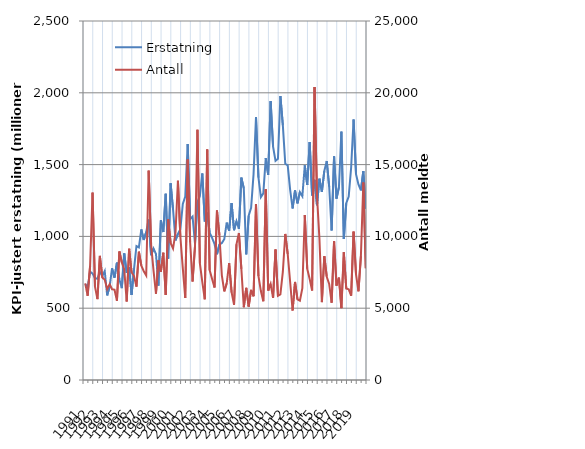
| Category | Erstatning |
|---|---|
| 1991.0 | 668.281 |
| nan | 646.488 |
| nan | 754.324 |
| nan | 741.503 |
| 1992.0 | 709.488 |
| nan | 704.957 |
| nan | 752.702 |
| nan | 722.519 |
| 1993.0 | 758.675 |
| nan | 589.203 |
| nan | 650.073 |
| nan | 777.991 |
| 1994.0 | 712.353 |
| nan | 817.185 |
| nan | 700.389 |
| nan | 639.47 |
| 1995.0 | 881.358 |
| nan | 744.95 |
| nan | 786.032 |
| nan | 592.778 |
| 1996.0 | 772.323 |
| nan | 933.033 |
| nan | 923.728 |
| nan | 1048.134 |
| 1997.0 | 974.883 |
| nan | 1030.942 |
| nan | 1117.681 |
| nan | 868.927 |
| 1998.0 | 915.401 |
| nan | 877.212 |
| nan | 657.44 |
| nan | 1111.934 |
| 1999.0 | 1030.252 |
| nan | 1297.352 |
| nan | 845.204 |
| nan | 1370.259 |
| 2000.0 | 1188.306 |
| nan | 972.49 |
| nan | 1016.713 |
| nan | 1049.276 |
| 2001.0 | 1226.506 |
| nan | 1276.704 |
| nan | 1643.899 |
| nan | 1120.334 |
| 2002.0 | 1137.902 |
| nan | 949.705 |
| nan | 1239.219 |
| nan | 1281.771 |
| 2003.0 | 1438.216 |
| nan | 1103.994 |
| nan | 1165.383 |
| nan | 1026.329 |
| 2004.0 | 989.843 |
| nan | 946.898 |
| nan | 875.658 |
| nan | 943.378 |
| 2005.0 | 953.6 |
| nan | 981.057 |
| nan | 1095.972 |
| nan | 1040.028 |
| 2006.0 | 1231.522 |
| nan | 1043.07 |
| nan | 1106.176 |
| nan | 1052.282 |
| 2007.0 | 1409.17 |
| nan | 1334.926 |
| nan | 874.596 |
| nan | 1144.153 |
| 2008.0 | 1198.374 |
| nan | 1433.738 |
| nan | 1830.653 |
| nan | 1410.233 |
| 2009.0 | 1273.319 |
| nan | 1299.997 |
| nan | 1545.135 |
| nan | 1427.627 |
| 2010.0 | 1941.823 |
| nan | 1625.025 |
| nan | 1525.727 |
| nan | 1540.444 |
| 2011.0 | 1977.903 |
| nan | 1774.53 |
| nan | 1505.925 |
| nan | 1494.93 |
| 2012.0 | 1324.128 |
| nan | 1194.609 |
| nan | 1320.157 |
| nan | 1230.041 |
| 2013.0 | 1308.757 |
| nan | 1279.746 |
| nan | 1494.976 |
| nan | 1358.756 |
| 2014.0 | 1657.681 |
| nan | 1285.071 |
| nan | 1394.138 |
| nan | 1216.813 |
| 2015.0 | 1401.901 |
| nan | 1310.472 |
| nan | 1455.344 |
| nan | 1524.92 |
| 2016.0 | 1346.209 |
| nan | 1041.678 |
| nan | 1557.164 |
| nan | 1262.935 |
| 2017.0 | 1342.496 |
| nan | 1729.741 |
| nan | 981.849 |
| nan | 1230.984 |
| 2018.0 | 1278.017 |
| nan | 1479.775 |
| nan | 1814.075 |
| nan | 1433.173 |
| 2019.0 | 1362.042 |
| nan | 1320.609 |
| nan | 1455.222 |
| nan | 1192.346 |